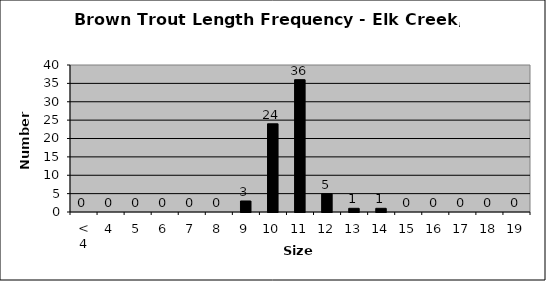
| Category | Series 0 |
|---|---|
| < 4 | 0 |
| 4 | 0 |
| 5 | 0 |
| 6 | 0 |
| 7 | 0 |
| 8 | 0 |
| 9 | 3 |
| 10 | 24 |
| 11 | 36 |
| 12 | 5 |
| 13 | 1 |
| 14 | 1 |
| 15 | 0 |
| 16 | 0 |
| 17 | 0 |
| 18 | 0 |
| 19 | 0 |